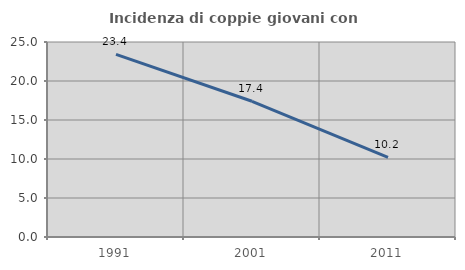
| Category | Incidenza di coppie giovani con figli |
|---|---|
| 1991.0 | 23.421 |
| 2001.0 | 17.402 |
| 2011.0 | 10.214 |